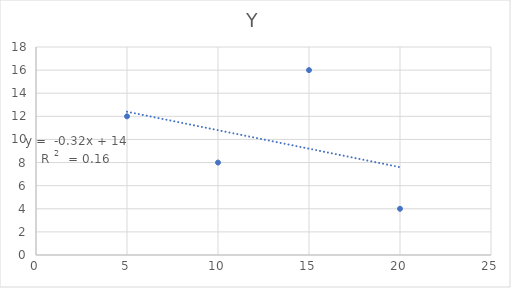
| Category | Y |
|---|---|
| 5.0 | 12 |
| 10.0 | 8 |
| 15.0 | 16 |
| 20.0 | 4 |